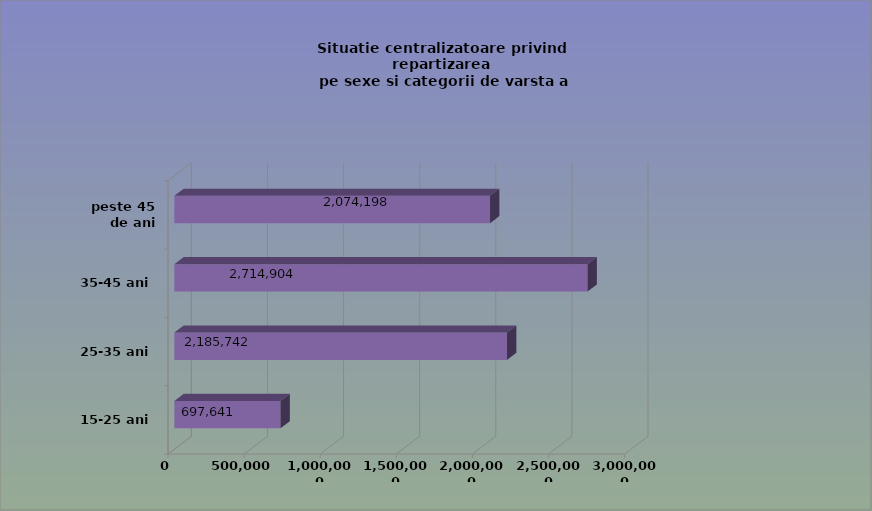
| Category | 15-25 ani 25-35 ani 35-45 ani peste 45 de ani |
|---|---|
| 15-25 ani | 697641 |
| 25-35 ani | 2185742 |
| 35-45 ani | 2714904 |
| peste 45 de ani | 2074198 |